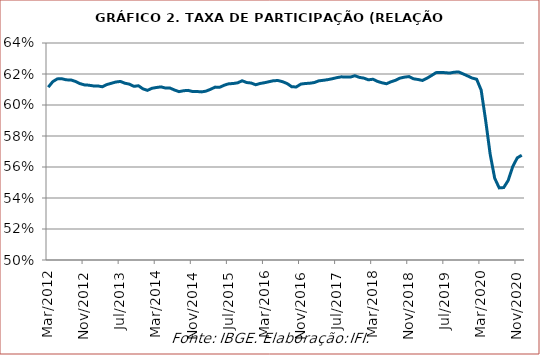
| Category | Taxa de participação (relação PEA/PIA) |
|---|---|
| 2012-03-01 | 0.611 |
| 2012-04-01 | 0.615 |
| 2012-05-01 | 0.617 |
| 2012-06-01 | 0.617 |
| 2012-07-01 | 0.616 |
| 2012-08-01 | 0.616 |
| 2012-09-01 | 0.615 |
| 2012-10-01 | 0.614 |
| 2012-11-01 | 0.613 |
| 2012-12-01 | 0.613 |
| 2013-01-01 | 0.612 |
| 2013-02-01 | 0.612 |
| 2013-03-01 | 0.612 |
| 2013-04-01 | 0.613 |
| 2013-05-01 | 0.614 |
| 2013-06-01 | 0.615 |
| 2013-07-01 | 0.615 |
| 2013-08-01 | 0.614 |
| 2013-09-01 | 0.613 |
| 2013-10-01 | 0.612 |
| 2013-11-01 | 0.612 |
| 2013-12-01 | 0.61 |
| 2014-01-01 | 0.609 |
| 2014-02-01 | 0.611 |
| 2014-03-01 | 0.611 |
| 2014-04-01 | 0.612 |
| 2014-05-01 | 0.611 |
| 2014-06-01 | 0.611 |
| 2014-07-01 | 0.61 |
| 2014-08-01 | 0.609 |
| 2014-09-01 | 0.609 |
| 2014-10-01 | 0.609 |
| 2014-11-01 | 0.609 |
| 2014-12-01 | 0.609 |
| 2015-01-01 | 0.608 |
| 2015-02-01 | 0.609 |
| 2015-03-01 | 0.61 |
| 2015-04-01 | 0.612 |
| 2015-05-01 | 0.611 |
| 2015-06-01 | 0.613 |
| 2015-07-01 | 0.614 |
| 2015-08-01 | 0.614 |
| 2015-09-01 | 0.614 |
| 2015-10-01 | 0.616 |
| 2015-11-01 | 0.614 |
| 2015-12-01 | 0.614 |
| 2016-01-01 | 0.613 |
| 2016-02-01 | 0.614 |
| 2016-03-01 | 0.614 |
| 2016-04-01 | 0.615 |
| 2016-05-01 | 0.616 |
| 2016-06-01 | 0.616 |
| 2016-07-01 | 0.615 |
| 2016-08-01 | 0.614 |
| 2016-09-01 | 0.612 |
| 2016-10-01 | 0.612 |
| 2016-11-01 | 0.613 |
| 2016-12-01 | 0.614 |
| 2017-01-01 | 0.614 |
| 2017-02-01 | 0.615 |
| 2017-03-01 | 0.616 |
| 2017-04-01 | 0.616 |
| 2017-05-01 | 0.616 |
| 2017-06-01 | 0.617 |
| 2017-07-01 | 0.618 |
| 2017-08-01 | 0.618 |
| 2017-09-01 | 0.618 |
| 2017-10-01 | 0.618 |
| 2017-11-01 | 0.619 |
| 2017-12-01 | 0.618 |
| 2018-01-01 | 0.617 |
| 2018-02-01 | 0.616 |
| 2018-03-01 | 0.617 |
| 2018-04-01 | 0.615 |
| 2018-05-01 | 0.614 |
| 2018-06-01 | 0.614 |
| 2018-07-01 | 0.615 |
| 2018-08-01 | 0.616 |
| 2018-09-01 | 0.617 |
| 2018-10-01 | 0.618 |
| 2018-11-01 | 0.618 |
| 2018-12-01 | 0.617 |
| 2019-01-01 | 0.616 |
| 2019-02-01 | 0.616 |
| 2019-03-01 | 0.617 |
| 2019-04-01 | 0.619 |
| 2019-05-01 | 0.621 |
| 2019-06-01 | 0.621 |
| 2019-07-01 | 0.621 |
| 2019-08-01 | 0.621 |
| 2019-09-01 | 0.621 |
| 2019-10-01 | 0.621 |
| 2019-11-01 | 0.62 |
| 2019-12-01 | 0.619 |
| 2020-01-01 | 0.617 |
| 2020-02-01 | 0.617 |
| 2020-03-01 | 0.61 |
| 2020-04-01 | 0.59 |
| 2020-05-01 | 0.568 |
| 2020-06-01 | 0.553 |
| 2020-07-01 | 0.547 |
| 2020-08-01 | 0.547 |
| 2020-09-01 | 0.551 |
| 2020-10-01 | 0.56 |
| 2020-11-01 | 0.566 |
| 2020-12-01 | 0.568 |